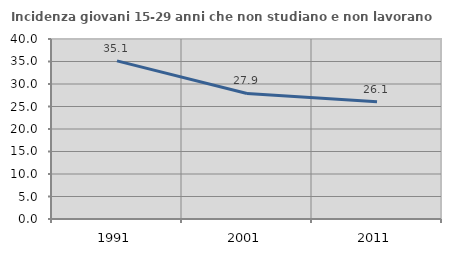
| Category | Incidenza giovani 15-29 anni che non studiano e non lavorano  |
|---|---|
| 1991.0 | 35.146 |
| 2001.0 | 27.895 |
| 2011.0 | 26.056 |